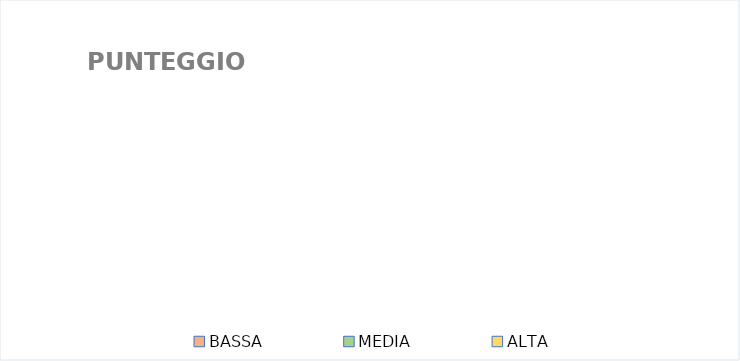
| Category | Series 0 |
|---|---|
| BASSA | 0 |
| MEDIA | 0 |
| ALTA | 0 |